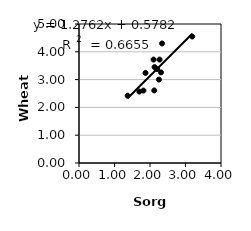
| Category | Series 0 |
|---|---|
| 1.37 | 2.42 |
| 1.7 | 2.57 |
| 2.27 | 3.72 |
| 2.1 | 3.72 |
| 2.12 | 2.61 |
| 2.2512 | 3 |
| 1.8732 | 3.24 |
| 2.31 | 3.26 |
| 2.128 | 3.45 |
| 3.19 | 4.55 |
| 2.34 | 4.3 |
| 2.2 | 3.38 |
| 1.8153884429 | 2.605 |